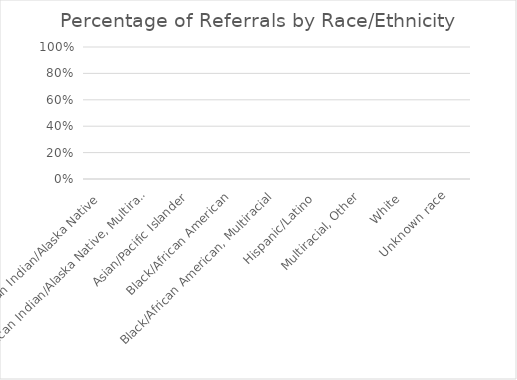
| Category | % of referred |
|---|---|
| American Indian/Alaska Native  | 0 |
| American Indian/Alaska Native, Multiracial | 0 |
| Asian/Pacific Islander | 0 |
| Black/African American | 0 |
| Black/African American, Multiracial | 0 |
| Hispanic/Latino  | 0 |
| Multiracial, Other | 0 |
| White  | 0 |
| Unknown race | 0 |